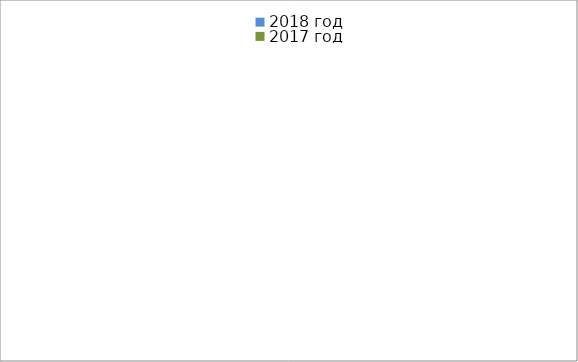
| Category | 2018 год | 2017 год |
|---|---|---|
|  - поджог | 11 | 12 |
|  - неосторожное обращение с огнём | 7 | 4 |
|  - НПТЭ электрооборудования | 15 | 13 |
|  - НПУ и Э печей | 48 | 33 |
|  - НПУ и Э транспортных средств | 34 | 38 |
|   -Шалость с огнем детей | 3 | 3 |
|  -НППБ при эксплуатации эл.приборов | 14 | 22 |
|  - курение | 16 | 21 |
| - прочие | 42 | 53 |
| - не установленные причины | 0 | 0 |